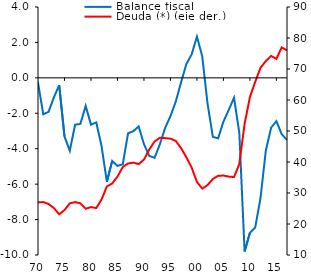
| Category | Balance fiscal |
|---|---|
| 1967-12-31 | -1.031 |
| 1968-12-31 | -2.798 |
| 1969-12-31 | 0.33 |
| 1970-12-31 | -0.271 |
| 1971-12-31 | -2.058 |
| 1972-12-31 | -1.917 |
| 1973-12-31 | -1.099 |
| 1974-12-31 | -0.413 |
| 1975-12-31 | -3.306 |
| 1976-12-31 | -4.118 |
| 1977-12-31 | -2.645 |
| 1978-12-31 | -2.598 |
| 1979-12-31 | -1.585 |
| 1980-12-31 | -2.64 |
| 1981-12-31 | -2.516 |
| 1982-12-31 | -3.862 |
| 1983-12-31 | -5.868 |
| 1984-12-31 | -4.689 |
| 1985-12-31 | -4.972 |
| 1986-12-31 | -4.877 |
| 1987-12-31 | -3.131 |
| 1988-12-31 | -3.01 |
| 1989-12-31 | -2.74 |
| 1990-12-31 | -3.737 |
| 1991-12-31 | -4.406 |
| 1992-12-31 | -4.512 |
| 1993-12-31 | -3.754 |
| 1994-12-31 | -2.823 |
| 1995-12-31 | -2.162 |
| 1996-12-31 | -1.347 |
| 1997-12-31 | -0.258 |
| 1998-12-31 | 0.774 |
| 1999-12-31 | 1.321 |
| 2000-12-31 | 2.328 |
| 2001-12-31 | 1.214 |
| 2002-12-31 | -1.45 |
| 2003-12-31 | -3.332 |
| 2004-12-31 | -3.414 |
| 2005-12-31 | -2.47 |
| 2006-12-31 | -1.814 |
| 2007-12-31 | -1.122 |
| 2008-12-31 | -3.108 |
| 2009-12-31 | -9.8 |
| 2010-12-31 | -8.747 |
| 2011-12-31 | -8.45 |
| 2012-12-31 | -6.782 |
| 2013-12-31 | -4.114 |
| 2014-12-31 | -2.814 |
| 2015-12-31 | -2.449 |
| 2016-12-31 | -3.176 |
| 2017-12-31 | -3.5 |